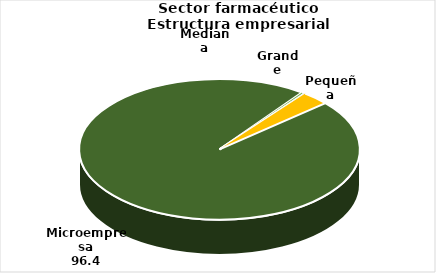
| Category | Series 1 |
|---|---|
| Grande | 0.336 |
| Mediana | 0.1 |
| Pequeña | 3.145 |
| Microempresa | 96.419 |